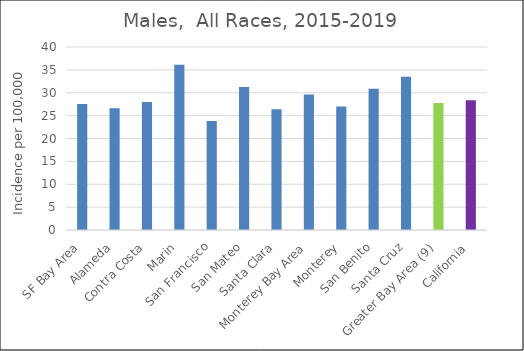
| Category | Male |
|---|---|
| SF Bay Area | 27.52 |
|   Alameda | 26.62 |
|   Contra Costa | 27.98 |
|   Marin | 36.13 |
|   San Francisco | 23.83 |
|   San Mateo | 31.24 |
|   Santa Clara | 26.4 |
| Monterey Bay Area | 29.63 |
|   Monterey | 26.97 |
|   San Benito | 30.85 |
|   Santa Cruz | 33.5 |
| Greater Bay Area (9) | 27.74 |
| California | 28.35 |